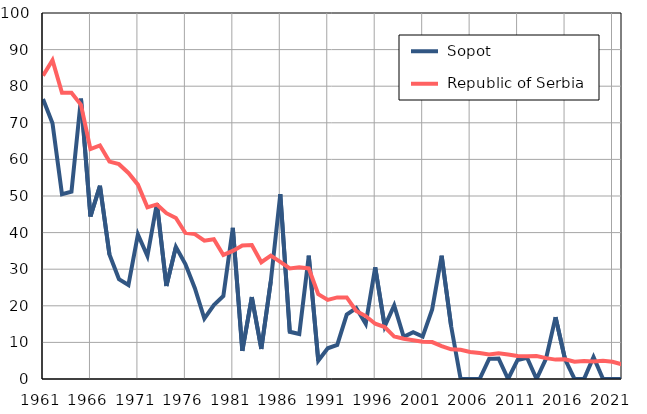
| Category |  Sopot |  Republic of Serbia |
|---|---|---|
| 1961.0 | 76.5 | 82.9 |
| 1962.0 | 69.9 | 87.1 |
| 1963.0 | 50.5 | 78.2 |
| 1964.0 | 51.2 | 78.2 |
| 1965.0 | 76.6 | 74.9 |
| 1966.0 | 44.4 | 62.8 |
| 1967.0 | 52.8 | 63.8 |
| 1968.0 | 34 | 59.4 |
| 1969.0 | 27.3 | 58.7 |
| 1970.0 | 25.7 | 56.3 |
| 1971.0 | 39.5 | 53.1 |
| 1972.0 | 33.6 | 46.9 |
| 1973.0 | 48 | 47.7 |
| 1974.0 | 25.4 | 45.3 |
| 1975.0 | 36.1 | 44 |
| 1976.0 | 31.4 | 39.9 |
| 1977.0 | 24.8 | 39.6 |
| 1978.0 | 16.5 | 37.8 |
| 1979.0 | 20.2 | 38.2 |
| 1980.0 | 22.7 | 33.9 |
| 1981.0 | 41.3 | 35 |
| 1982.0 | 7.7 | 36.5 |
| 1983.0 | 22.4 | 36.6 |
| 1984.0 | 8.2 | 31.9 |
| 1985.0 | 26.7 | 33.7 |
| 1986.0 | 50.5 | 32 |
| 1987.0 | 12.9 | 30.2 |
| 1988.0 | 12.3 | 30.5 |
| 1989.0 | 33.7 | 30.2 |
| 1990.0 | 5 | 23.2 |
| 1991.0 | 8.4 | 21.6 |
| 1992.0 | 9.3 | 22.3 |
| 1993.0 | 17.6 | 22.3 |
| 1994.0 | 19.4 | 18.6 |
| 1995.0 | 15.1 | 17.2 |
| 1996.0 | 30.5 | 15.1 |
| 1997.0 | 14.4 | 14.2 |
| 1998.0 | 20.1 | 11.6 |
| 1999.0 | 11.5 | 11 |
| 2000.0 | 12.8 | 10.6 |
| 2001.0 | 11.6 | 10.2 |
| 2002.0 | 19 | 10.1 |
| 2003.0 | 33.7 | 9 |
| 2004.0 | 14.4 | 8.1 |
| 2005.0 | 0 | 8 |
| 2006.0 | 0 | 7.4 |
| 2007.0 | 0 | 7.1 |
| 2008.0 | 5.5 | 6.7 |
| 2009.0 | 5.6 | 7 |
| 2010.0 | 0 | 6.7 |
| 2011.0 | 5.2 | 6.3 |
| 2012.0 | 5.8 | 6.2 |
| 2013.0 | 0 | 6.3 |
| 2014.0 | 5.6 | 5.7 |
| 2015.0 | 16.9 | 5.3 |
| 2016.0 | 5.4 | 5.4 |
| 2017.0 | 0 | 4.7 |
| 2018.0 | 0 | 4.9 |
| 2019.0 | 6 | 4.8 |
| 2020.0 | 0 | 5 |
| 2021.0 | 0 | 4.7 |
| 2022.0 | 0 | 4 |